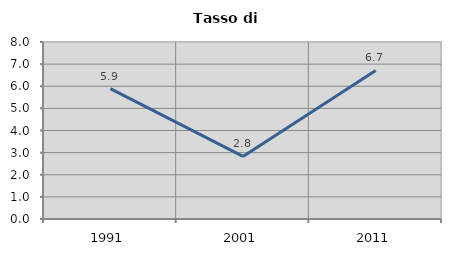
| Category | Tasso di disoccupazione   |
|---|---|
| 1991.0 | 5.892 |
| 2001.0 | 2.829 |
| 2011.0 | 6.713 |